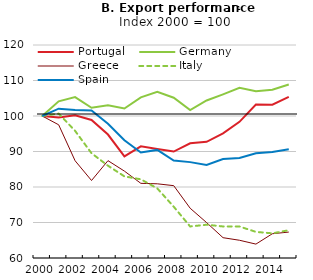
| Category | Portugal | Germany | Greece | Italy | Spain |
|---|---|---|---|---|---|
| 2000.0 | 100 | 100 | 100 | 100 | 100 |
| 2001.0 | 99.56 | 104.129 | 97.525 | 100.679 | 102.071 |
| 2002.0 | 100.187 | 105.323 | 87.393 | 95.81 | 101.693 |
| 2003.0 | 98.886 | 102.306 | 81.829 | 89.51 | 101.527 |
| 2004.0 | 94.779 | 103.012 | 87.421 | 86.001 | 97.823 |
| 2005.0 | 88.637 | 102.098 | 84.475 | 82.993 | 93.183 |
| 2006.0 | 91.469 | 105.256 | 81.033 | 82.165 | 89.73 |
| 2007.0 | 90.728 | 106.834 | 80.9 | 79.61 | 90.452 |
| 2008.0 | 89.991 | 105.143 | 80.378 | 74.453 | 87.453 |
| 2009.0 | 92.315 | 101.653 | 74.015 | 68.88 | 87.006 |
| 2010.0 | 92.732 | 104.379 | 69.978 | 69.375 | 86.194 |
| 2011.0 | 95.1 | 106.1 | 65.719 | 68.886 | 87.871 |
| 2012.0 | 98.352 | 107.921 | 65 | 68.871 | 88.169 |
| 2013.0 | 103.241 | 106.982 | 63.914 | 67.356 | 89.514 |
| 2014.0 | 103.183 | 107.395 | 66.834 | 66.946 | 89.871 |
| 2015.0 | 105.369 | 108.865 | 67.304 | 67.83 | 90.611 |